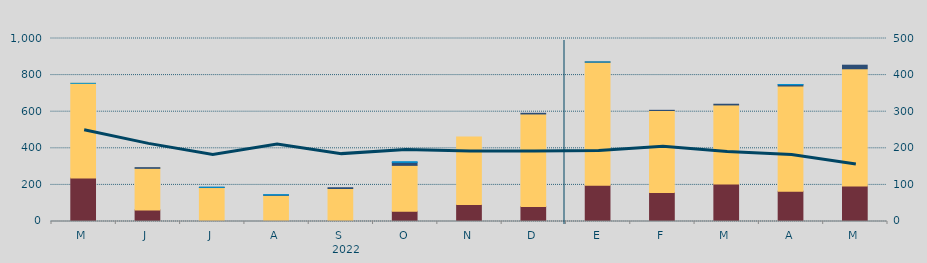
| Category | Carbón | Ciclo Combinado | Cogeneración | Consumo Bombeo | Eólica | Hidráulica | Otras Renovables | Solar fotovoltaica | Solar térmica | Turbinación bombeo | Nuclear |
|---|---|---|---|---|---|---|---|---|---|---|---|
| M | 238246.1 | 516625.8 | 0 | 0 | 0 | 170 | 0 | 0 | 0 | 0 | 0 |
| J | 63431.6 | 227120.9 | 0 | 3696.9 | 0 | 0 | 0 | 0 | 0 | 0 | 0 |
| J | 347.9 | 185242.2 | 0 | 1000 | 0 | 958 | 0 | 0 | 0 | 0 | 0 |
| A | 0 | 142890.1 | 241.5 | 1836 | 0 | 1759 | 0 | 0 | 0 | 0 | 0 |
| S | 2508 | 177724.1 | 0 | 4233 | 0 | 0 | 52.5 | 0 | 0 | 0 | 0 |
| O | 55771 | 250950.8 | 0 | 16354.2 | 0 | 3609 | 27 | 0 | 0 | 0 | 0 |
| N | 92910 | 369242.3 | 0 | 0 | 0 | 0 | 0 | 0 | 0 | 0 | 0 |
| D | 82210 | 505508.6 | 0 | 3568.7 | 0 | 0 | 0 | 0 | 0 | 0 | 0 |
| E | 198667 | 672278.9 | 0 | 600 | 0 | 167.2 | 0 | 0 | 0 | 0 | 0 |
| F | 158446.8 | 448230.6 | 0 | 876 | 0 | 0 | 0 | 0 | 0 | 0 | 0 |
| M | 205470 | 431456.4 | 0 | 3844 | 0 | 0 | 0 | 0 | 0 | 0 | 0 |
| A | 165579 | 574881.6 | 0 | 7190 | 0 | 954 | 0 | 0 | 0 | 0 | 0 |
| M | 194640 | 639265.9 | 701 | 19503.3 | 0 | 0 | 0 | 0 | 0 | 0 | 0 |